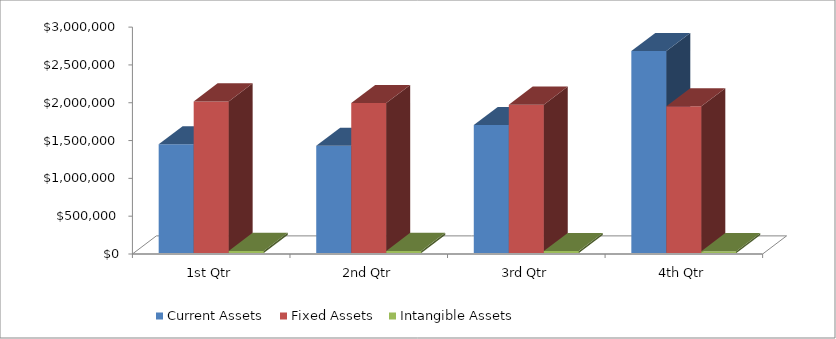
| Category | Current Assets | Fixed Assets | Intangible Assets |
|---|---|---|---|
| 1st Qtr | 1438305 | 2005000 | 28750 |
| 2nd Qtr | 1418433 | 1983542 | 27500 |
| 3rd Qtr | 1693091 | 1962084 | 26250 |
| 4th Qtr | 2671071 | 1940626 | 25000 |